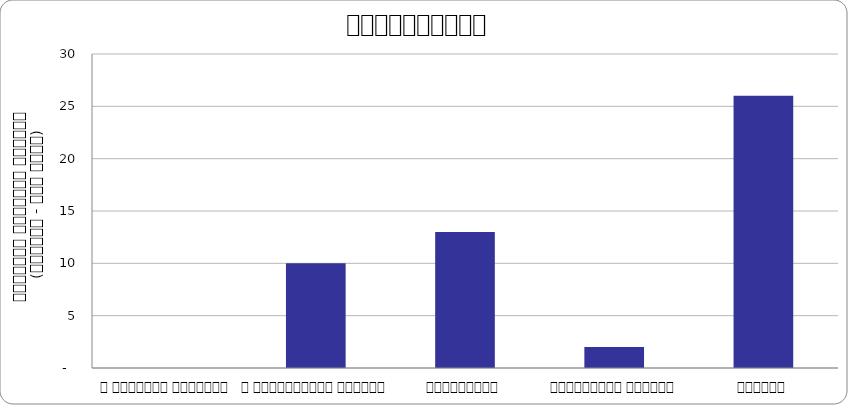
| Category | भ्रष्टाचार |
|---|---|
| द हिमालयन टाइम्स् | 0 |
| द काठमाण्डौं पोस्ट् | 10 |
| कान्तिपुर | 13 |
| अन्नपूर्ण पोस्ट् | 2 |
| नागरिक | 26 |